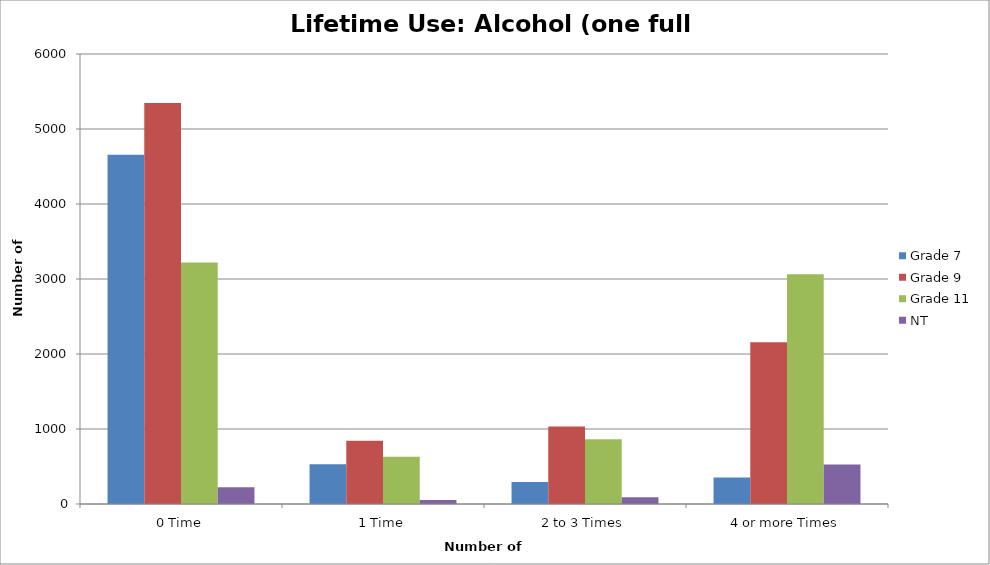
| Category | Grade 7 | Grade 9 | Grade 11 | NT |
|---|---|---|---|---|
| 0 Time | 4655.47 | 5346.03 | 3221.37 | 223.25 |
| 1 Time | 530.37 | 844.11 | 628.56 | 53.58 |
| 2 to 3 Times | 294.65 | 1031.69 | 864.27 | 89.3 |
| 4 or more Times | 353.58 | 2157.17 | 3064.23 | 526.87 |